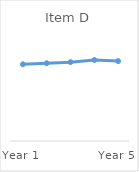
| Category | Item D |
|---|---|
| Year 1 | 0.71 |
| Year 2 | 0.72 |
| Year 3 | 0.73 |
| Year 4 | 0.75 |
| Year 5 | 0.74 |